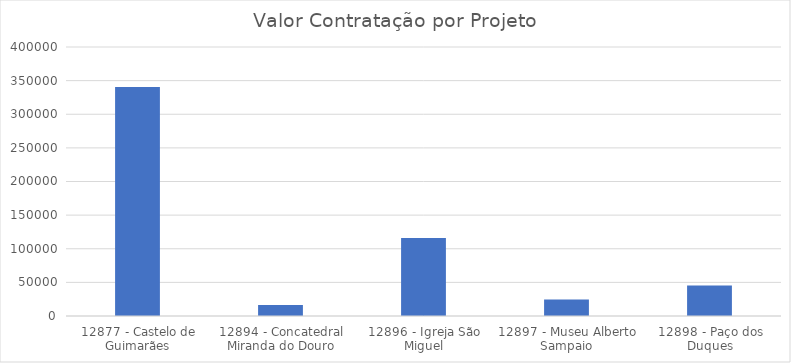
| Category | Total |
|---|---|
| 12877 - Castelo de Guimarães | 340367.42 |
| 12894 - Concatedral Miranda do Douro | 16272.9 |
| 12896 - Igreja São Miguel | 115846.554 |
| 12897 - Museu Alberto Sampaio | 24477 |
| 12898 - Paço dos Duques | 45448.5 |